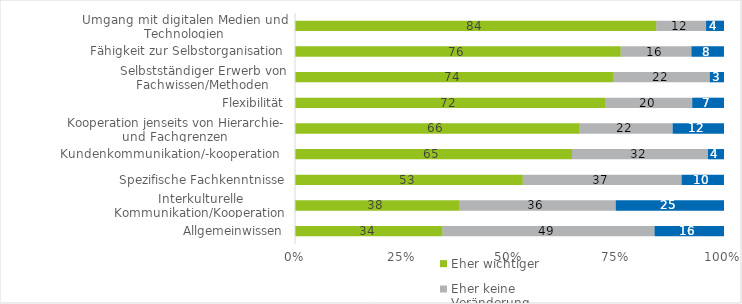
| Category | Eher wichtiger | Eher keine Veränderung | Eher unwichtiger |
|---|---|---|---|
| Umgang mit digitalen Medien und Technologien | 84.23 | 11.59 | 4.18 |
| Fähigkeit zur Selbstorganisation | 75.92 | 16.48 | 7.6 |
| Selbstständiger Erwerb von Fachwissen/Methoden | 73.93 | 22.32 | 3.31 |
| Flexibilität | 72.41 | 20.18 | 7.41 |
| Kooperation jenseits von Hierarchie- und Fachgrenzen  | 66.34 | 21.68 | 11.98 |
| Kundenkommunikation/-kooperation  | 64.52 | 31.66 | 3.75 |
| Spezifische Fachkenntnisse | 53.09 | 37.01 | 9.89 |
| Interkulturelle Kommunikation/Kooperation | 38.27 | 36.48 | 25.25 |
| Allgemeinwissen | 34.37 | 49.44 | 16.2 |